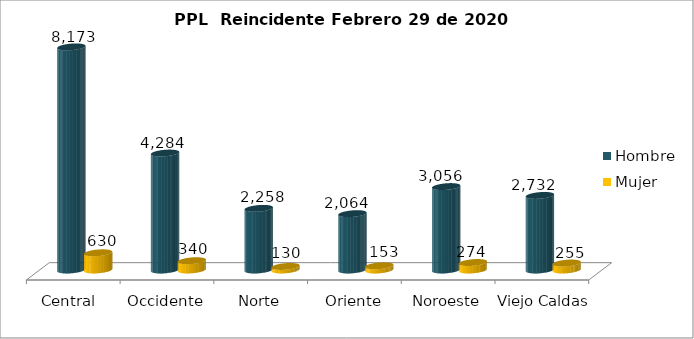
| Category | Hombre | Mujer |
|---|---|---|
| Central  | 8173 | 630 |
| Occidente | 4284 | 340 |
| Norte | 2258 | 130 |
| Oriente | 2064 | 153 |
| Noroeste | 3056 | 274 |
| Viejo Caldas | 2732 | 255 |